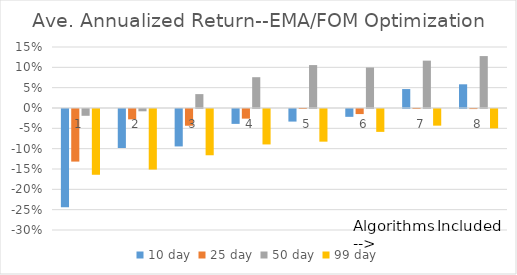
| Category | 10 day | 25 day | 50 day | 99 day |
|---|---|---|---|---|
| 1.0 | -0.241 | -0.129 | -0.017 | -0.162 |
| 2.0 | -0.096 | -0.025 | -0.006 | -0.149 |
| 3.0 | -0.092 | -0.041 | 0.034 | -0.114 |
| 4.0 | -0.037 | -0.024 | 0.076 | -0.087 |
| 5.0 | -0.031 | 0 | 0.106 | -0.08 |
| 6.0 | -0.019 | -0.012 | 0.1 | -0.056 |
| 7.0 | 0.047 | 0 | 0.116 | -0.041 |
| 8.0 | 0.058 | 0 | 0.128 | -0.048 |